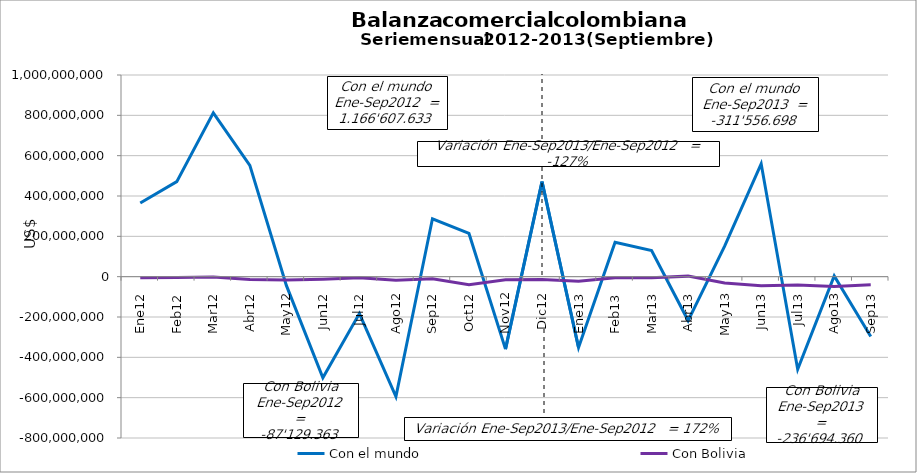
| Category | Con el mundo | Con Bolivia |
|---|---|---|
| 0 | 365236896.39 | -5492642.75 |
| 1 | 471254376.48 | -3836163.3 |
| 2 | 812672155.33 | -1448882.58 |
| 3 | 552212453.87 | -13891962.23 |
| 4 | -43303050.56 | -16053328.19 |
| 5 | -501300545.37 | -12353843 |
| 6 | -182769268.25 | -5066623.28 |
| 7 | -594402576.84 | -18350780.48 |
| 8 | 287007192.43 | -10635137.17 |
| 9 | 214327872.41 | -39745388.9 |
| 10 | -359526323.33 | -14876039.44 |
| 11 | 471322651.54 | -13562880.19 |
| 12 | -351699235.93 | -22547246.96 |
| 13 | 170276250.68 | -5046653.8 |
| 14 | 129706117.85 | -4868840.99 |
| 15 | -217650665.27 | 2666025.2 |
| 16 | 151125826.62 | -31799952.03 |
| 17 | 559734024.39 | -44906259.85 |
| 18 | -459551452.93 | -41200326.58 |
| 19 | 3446839.04 | -49045771.02 |
| 20 | -296944402.01 | -39945333.94 |